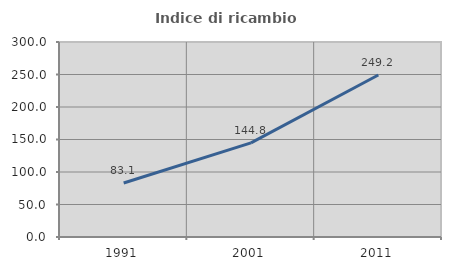
| Category | Indice di ricambio occupazionale  |
|---|---|
| 1991.0 | 83.133 |
| 2001.0 | 144.776 |
| 2011.0 | 249.206 |